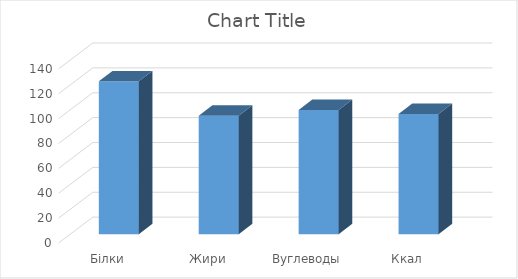
| Category | Series 0 |
|---|---|
| Білки | 122.936 |
| Жири | 95.302 |
| Вуглеводы | 99.856 |
| Ккал | 96.684 |